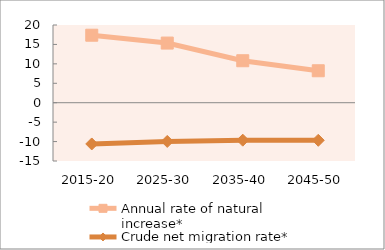
| Category | Annual rate of natural increase* | Crude net migration rate* |
|---|---|---|
| 2015-20 | 17.372 | -10.614 |
| 2025-30 | 15.351 | -9.964 |
| 2035-40 | 10.803 | -9.642 |
| 2045-50 | 8.225 | -9.67 |